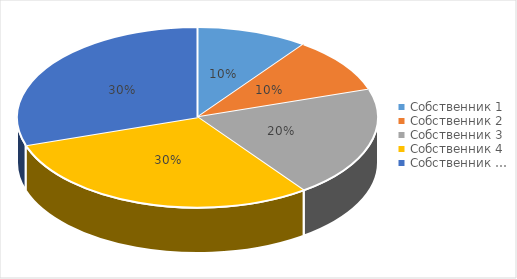
| Category | Series 0 |
|---|---|
| Собственник 1 | 0.1 |
| Собственник 2 | 0.1 |
| Собственник 3 | 0.2 |
| Собственник 4 | 0.3 |
| Собственник … | 0.3 |